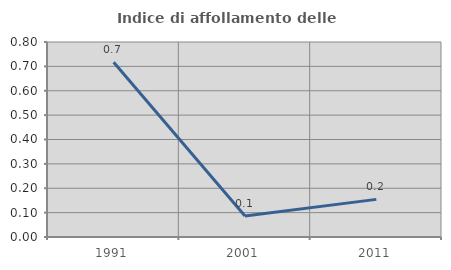
| Category | Indice di affollamento delle abitazioni  |
|---|---|
| 1991.0 | 0.717 |
| 2001.0 | 0.086 |
| 2011.0 | 0.154 |